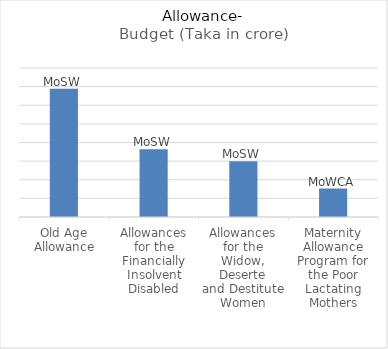
| Category | Budget (Taka in crore) |
|---|---|
| Old Age Allowance | 3444.54 |
| Allowances for the Financially
Insolvent Disabled | 1820 |
| Allowances for the Widow, Deserte
and Destitute Women | 1495.4 |
| Maternity Allowance Program for
the Poor Lactating Mothers | 764.39 |